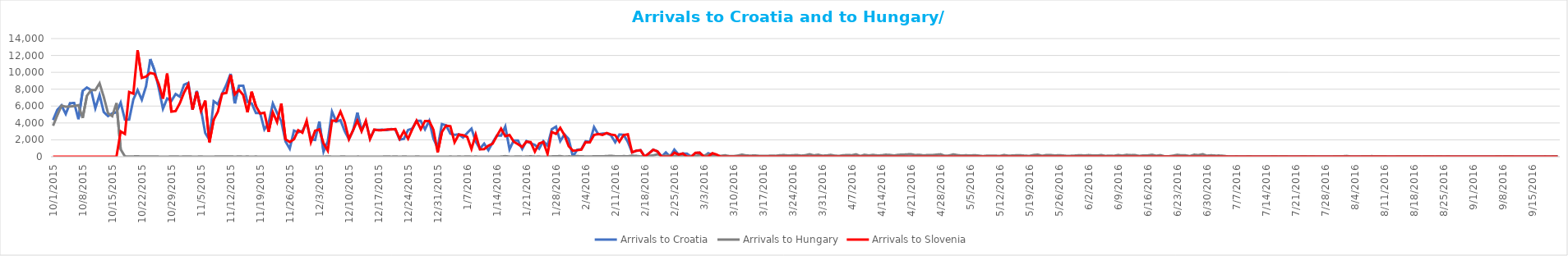
| Category | Arrivals to Croatia | Arrivals to Hungary | Arrivals to Slovenia |
|---|---|---|---|
| 10/1/15 | 4344 | 3667 | 0 |
| 10/2/15 | 5546 | 4897 | 0 |
| 10/3/15 | 6086 | 6056 | 0 |
| 10/4/15 | 5065 | 5925 | 0 |
| 10/5/15 | 6338 | 5952 | 0 |
| 10/6/15 | 6370 | 6000 | 0 |
| 10/7/15 | 4446 | 6103 | 0 |
| 10/8/15 | 7798 | 4583 | 6 |
| 10/9/15 | 8201 | 7215 | 0 |
| 10/10/15 | 7896 | 7907 | 0 |
| 10/11/15 | 5732 | 7897 | 0 |
| 10/12/15 | 7317 | 8702 | 0 |
| 10/13/15 | 5286 | 7081 | 0 |
| 10/14/15 | 4814 | 5157 | 0 |
| 10/15/15 | 5138 | 4808 | 0 |
| 10/16/15 | 5260 | 6353 | 0 |
| 10/17/15 | 6415 | 870 | 3000 |
| 10/18/15 | 4390 | 41 | 2700 |
| 10/19/15 | 4388 | 22 | 7677 |
| 10/20/15 | 6793 | 36 | 7478 |
| 10/21/15 | 7900 | 39 | 12616 |
| 10/22/15 | 6748 | 32 | 9339 |
| 10/23/15 | 8348 | 29 | 9500 |
| 10/24/15 | 11570 | 35 | 9925 |
| 10/25/15 | 10249 | 34 | 9818 |
| 10/26/15 | 8128 | 12 | 8625 |
| 10/27/15 | 5683 | 7 | 6877 |
| 10/28/15 | 6900 | 4 | 9848 |
| 10/29/15 | 6615 | 23 | 5341 |
| 10/30/15 | 7429 | 18 | 5409 |
| 10/31/15 | 7110 | 10 | 6344 |
| 11/1/15 | 8534 | 14 | 7611 |
| 11/2/15 | 8746 | 31 | 8568 |
| 11/3/15 | 5573 | 8 | 5591 |
| 11/4/15 | 7792 | 10 | 7693 |
| 11/5/15 | 5587 | 18 | 5426 |
| 11/6/15 | 2809 | 4 | 6655 |
| 11/7/15 | 2000 | 8 | 1716 |
| 11/8/15 | 6579 | 9 | 4381 |
| 11/9/15 | 6214 | 25 | 5341 |
| 11/10/15 | 7474 | 14 | 7457 |
| 11/11/15 | 8524 | 13 | 7554 |
| 11/12/15 | 9823 | 23 | 9681 |
| 11/13/15 | 6314 | 6 | 7397 |
| 11/14/15 | 8405 | 21 | 7905 |
| 11/15/15 | 8415 | 8 | 7300 |
| 11/16/15 | 6490 | 15 | 5261 |
| 11/17/15 | 6304 | 5 | 7704 |
| 11/18/15 | 5180 | 15 | 5998 |
| 11/19/15 | 5167 | 4 | 5119 |
| 11/20/15 | 3230 | 9 | 5211 |
| 11/21/15 | 3977 | 2 | 2952 |
| 11/22/15 | 6305 | 11 | 5260 |
| 11/23/15 | 5184 | 4 | 4102 |
| 11/24/15 | 4203 | 4 | 6297 |
| 11/25/15 | 1808 | 6 | 2070 |
| 11/26/15 | 952 | 10 | 1742 |
| 11/27/15 | 3095 | 2 | 2065 |
| 11/28/15 | 2886 | 6 | 3139 |
| 11/29/15 | 3060 | 3 | 2843 |
| 11/30/15 | 4009 | 7 | 4274 |
| 12/1/15 | 2066 | 4 | 1709 |
| 12/2/15 | 1982 | 4 | 3077 |
| 12/3/15 | 4174 | 9 | 3237 |
| 12/4/15 | 611 | 1 | 1577 |
| 12/5/15 | 1835 | 31 | 715 |
| 12/6/15 | 5339 | 7 | 4288 |
| 12/7/15 | 4162 | 0 | 4240 |
| 12/8/15 | 4335 | 13 | 5351 |
| 12/9/15 | 3027 | 14 | 4103 |
| 12/10/15 | 2076 | 3 | 2078 |
| 12/11/15 | 3149 | 0 | 3149 |
| 12/12/15 | 5225 | 13 | 4271 |
| 12/13/15 | 3112 | 10 | 3016 |
| 12/14/15 | 4174 | 3 | 4250 |
| 12/15/15 | 2160 | 2 | 2098 |
| 12/16/15 | 3177 | 6 | 3214 |
| 12/17/15 | 3192 | 0 | 3135 |
| 12/18/15 | 3200 | 11 | 3150 |
| 12/19/15 | 3156 | 31 | 3222 |
| 12/20/15 | 3276 | 8 | 3233 |
| 12/21/15 | 3210 | 25 | 3278 |
| 12/22/15 | 2027 | 1 | 2118 |
| 12/23/15 | 2116 | 21 | 3030 |
| 12/24/15 | 3166 | 8 | 2131 |
| 12/25/15 | 3339 | 2 | 3257 |
| 12/26/15 | 4241 | 17 | 4274 |
| 12/27/15 | 4251 | 10 | 3253 |
| 12/28/15 | 3249 | 0 | 4228 |
| 12/29/15 | 4253 | 0 | 4239 |
| 12/30/15 | 2132 | 11 | 3195 |
| 12/31/15 | 1058 | 0 | 511 |
| 1/1/16 | 3869 | 0 | 2914 |
| 1/2/16 | 3710 | 0 | 3690 |
| 1/3/16 | 2732 | 17 | 3619 |
| 1/4/16 | 2591 | 3 | 1708 |
| 1/5/16 | 2650 | 18 | 2626 |
| 1/6/16 | 2273 | 5 | 2550 |
| 1/7/16 | 2814 | 31 | 2337 |
| 1/8/16 | 3332 | 7 | 916 |
| 1/9/16 | 1799 | 15 | 2630 |
| 1/10/16 | 942 | 6 | 880 |
| 1/11/16 | 1549 | 7 | 897 |
| 1/12/16 | 769 | 2 | 1308 |
| 1/13/16 | 1679 | 5 | 1544 |
| 1/14/16 | 2502 | 4 | 2449 |
| 1/15/16 | 2493 | 14 | 3330 |
| 1/16/16 | 3579 | 65 | 2435 |
| 1/17/16 | 878 | 11 | 2570 |
| 1/18/16 | 1930 | 9 | 1783 |
| 1/19/16 | 1917 | 29 | 1476 |
| 1/20/16 | 914 | 10 | 1154 |
| 1/21/16 | 1865 | 13 | 1787 |
| 1/22/16 | 1599 | 47 | 1738 |
| 1/23/16 | 1394 | 10 | 606 |
| 1/24/16 | 946 | 15 | 1564 |
| 1/25/16 | 1847 | 5 | 1746 |
| 1/26/16 | 1309 | 4 | 326 |
| 1/27/16 | 3256 | 36 | 2935 |
| 1/28/16 | 3565 | 51 | 2719 |
| 1/29/16 | 1843 | 69 | 3416 |
| 1/30/16 | 2641 | 6 | 2556 |
| 1/31/16 | 2098 | 39 | 1249 |
| 2/1/16 | 0 | 31 | 716 |
| 2/2/16 | 822 | 69 | 765 |
| 2/3/16 | 881 | 46 | 841 |
| 2/4/16 | 1836 | 31 | 1733 |
| 2/5/16 | 1750 | 19 | 1713 |
| 2/6/16 | 3510 | 49 | 2580 |
| 2/7/16 | 2658 | 53 | 2694 |
| 2/8/16 | 2736 | 48 | 2582 |
| 2/9/16 | 2764 | 72 | 2805 |
| 2/10/16 | 2544 | 104 | 2637 |
| 2/11/16 | 1716 | 54 | 2547 |
| 2/12/16 | 2635 | 39 | 1774 |
| 2/13/16 | 2595 | 66 | 2576 |
| 2/14/16 | 1749 | 51 | 2660 |
| 2/15/16 | 512 | 119 | 516 |
| 2/16/16 | 701 | 93 | 715 |
| 2/17/16 | 769 | 34 | 769 |
| 2/18/16 | 0 | 73 | 0 |
| 2/19/16 | 408 | 113 | 407 |
| 2/20/16 | 834 | 151 | 828 |
| 2/21/16 | 630 | 288 | 623 |
| 2/22/16 | 0 | 103 | 0 |
| 2/23/16 | 507 | 112 | 0 |
| 2/24/16 | 0 | 166 | 0 |
| 2/25/16 | 841 | 76 | 478 |
| 2/26/16 | 250 | 140 | 254 |
| 2/27/16 | 385 | 111 | 382 |
| 2/28/16 | 358 | 62 | 0 |
| 2/29/16 | 0 | 78 | 0 |
| 3/1/16 | 436 | 83 | 466 |
| 3/2/16 | 476 | 181 | 479 |
| 3/3/16 | 0 | 133 | 0 |
| 3/4/16 | 410 | 268 | 0 |
| 3/5/16 | 253 | 89 | 409 |
| 3/6/16 | 0 | 72 | 253 |
| 3/7/16 | 0 | 100 | 0 |
| 3/8/16 | 0 | 167 | 0 |
| 3/9/16 | 0 | 73 | 0 |
| 3/10/16 | 0 | 70 | 0 |
| 3/11/16 | 0 | 133 | 0 |
| 3/12/16 | 0 | 245 | 0 |
| 3/13/16 | 0 | 148 | 0 |
| 3/14/16 | 0 | 123 | 0 |
| 3/15/16 | 0 | 153 | 0 |
| 3/16/16 | 0 | 104 | 0 |
| 3/17/16 | 0 | 102 | 0 |
| 3/18/16 | 0 | 95 | 0 |
| 3/19/16 | 0 | 132 | 0 |
| 3/20/16 | 0 | 107 | 0 |
| 3/21/16 | 0 | 176 | 0 |
| 3/22/16 | 0 | 188 | 0 |
| 3/23/16 | 0 | 137 | 0 |
| 3/24/16 | 0 | 171 | 0 |
| 3/25/16 | 0 | 199 | 0 |
| 3/26/16 | 0 | 125 | 0 |
| 3/27/16 | 0 | 171 | 6 |
| 3/28/16 | 0 | 293 | 0 |
| 3/29/16 | 0 | 154 | 5 |
| 3/30/16 | 0 | 234 | 4 |
| 3/31/16 | 0 | 127 | 0 |
| 4/1/16 | 0 | 142 | 0 |
| 4/2/16 | 0 | 217 | 0 |
| 4/3/16 | 0 | 119 | 0 |
| 4/4/16 | 0 | 99 | 0 |
| 4/5/16 | 0 | 176 | 2 |
| 4/6/16 | 0 | 191 | 0 |
| 4/7/16 | 0 | 178 | 0 |
| 4/8/16 | 0 | 280 | 0 |
| 4/9/16 | 0 | 83 | 0 |
| 4/10/16 | 0 | 230 | 0 |
| 4/11/16 | 0 | 149 | 0 |
| 4/12/16 | 0 | 214 | 0 |
| 4/13/16 | 0 | 150 | 0 |
| 4/14/16 | 0 | 161 | 0 |
| 4/15/16 | 0 | 237 | 0 |
| 4/16/16 | 0 | 210 | 0 |
| 4/17/16 | 0 | 144 | 0 |
| 4/18/16 | 0 | 229 | 0 |
| 4/19/16 | 0 | 235 | 0 |
| 4/20/16 | 0 | 274 | 0 |
| 4/21/16 | 0 | 294 | 0 |
| 4/22/16 | 0 | 195 | 0 |
| 4/23/16 | 0 | 226 | 0 |
| 4/24/16 | 0 | 151 | 0 |
| 4/25/16 | 0 | 202 | 0 |
| 4/26/16 | 0 | 190 | 0 |
| 4/27/16 | 0 | 241 | 0 |
| 4/28/16 | 0 | 284 | 0 |
| 4/29/16 | 0 | 108 | 0 |
| 4/30/16 | 0 | 141 | 0 |
| 5/1/16 | 0 | 274 | 0 |
| 5/2/16 | 0 | 187 | 0 |
| 5/3/16 | 0 | 131 | 0 |
| 5/4/16 | 0 | 169 | 0 |
| 5/5/16 | 0 | 133 | 0 |
| 5/6/16 | 0 | 178 | 0 |
| 5/7/16 | 0 | 132 | 0 |
| 5/8/16 | 0 | 75 | 0 |
| 5/9/16 | 0 | 124 | 0 |
| 5/10/16 | 0 | 128 | 0 |
| 5/11/16 | 0 | 120 | 0 |
| 5/12/16 | 0 | 89 | 0 |
| 5/13/16 | 0 | 201 | 0 |
| 5/14/16 | 0 | 120 | 0 |
| 5/15/16 | 0 | 139 | 0 |
| 5/16/16 | 0 | 169 | 0 |
| 5/17/16 | 0 | 164 | 0 |
| 5/18/16 | 0 | 121 | 0 |
| 5/19/16 | 0 | 100 | 0 |
| 5/20/16 | 0 | 198 | 0 |
| 5/21/16 | 0 | 245 | 0 |
| 5/22/16 | 0 | 108 | 0 |
| 5/23/16 | 0 | 193 | 0 |
| 5/24/16 | 0 | 198 | 0 |
| 5/25/16 | 0 | 139 | 0 |
| 5/26/16 | 0 | 181 | 0 |
| 5/27/16 | 0 | 144 | 0 |
| 5/28/16 | 0 | 92 | 0 |
| 5/29/16 | 0 | 115 | 0 |
| 5/30/16 | 0 | 140 | 0 |
| 5/31/16 | 0 | 182 | 0 |
| 6/1/16 | 0 | 138 | 0 |
| 6/2/16 | 0 | 187 | 0 |
| 6/3/16 | 0 | 146 | 0 |
| 6/4/16 | 0 | 135 | 0 |
| 6/5/16 | 0 | 193 | 0 |
| 6/6/16 | 0 | 100 | 0 |
| 6/7/16 | 0 | 131 | 0 |
| 6/8/16 | 0 | 104 | 0 |
| 6/9/16 | 0 | 201 | 0 |
| 6/10/16 | 0 | 129 | 0 |
| 6/11/16 | 0 | 219 | 0 |
| 6/12/16 | 0 | 181 | 0 |
| 6/13/16 | 0 | 189 | 0 |
| 6/14/16 | 0 | 95 | 0 |
| 6/15/16 | 0 | 155 | 0 |
| 6/16/16 | 0 | 147 | 0 |
| 6/17/16 | 0 | 230 | 0 |
| 6/18/16 | 0 | 114 | 0 |
| 6/19/16 | 0 | 185 | 0 |
| 6/20/16 | 0 | 47 | 0 |
| 6/21/16 | 0 | 52 | 0 |
| 6/22/16 | 0 | 125 | 0 |
| 6/23/16 | 0 | 223 | 0 |
| 6/24/16 | 0 | 159 | 0 |
| 6/25/16 | 0 | 159 | 0 |
| 6/26/16 | 0 | 75 | 0 |
| 6/27/16 | 0 | 238 | 0 |
| 6/28/16 | 0 | 186 | 0 |
| 6/29/16 | 0 | 295 | 0 |
| 6/30/16 | 0 | 125 | 0 |
| 7/1/16 | 0 | 167 | 0 |
| 7/2/16 | 0 | 133 | 0 |
| 7/3/16 | 0 | 134 | 0 |
| 7/4/16 | 0 | 99 | 0 |
| 7/5/16 | 0 | 30 | 0 |
| 7/6/16 | 0 | 33 | 0 |
| 7/7/16 | 0 | 38 | 0 |
| 7/8/16 | 0 | 32 | 0 |
| 7/9/16 | 0 | 31 | 0 |
| 7/10/16 | 0 | 48 | 0 |
| 7/11/16 | 0 | 29 | 0 |
| 7/12/16 | 0 | 30 | 0 |
| 7/13/16 | 0 | 33 | 0 |
| 7/14/16 | 0 | 34 | 0 |
| 7/15/16 | 0 | 35 | 0 |
| 7/16/16 | 0 | 47 | 0 |
| 7/17/16 | 0 | 32 | 0 |
| 7/18/16 | 0 | 48 | 0 |
| 7/19/16 | 0 | 37 | 0 |
| 7/20/16 | 0 | 31 | 0 |
| 7/21/16 | 0 | 35 | 0 |
| 7/22/16 | 0 | 35 | 0 |
| 7/23/16 | 0 | 46 | 0 |
| 7/24/16 | 0 | 31 | 0 |
| 7/25/16 | 0 | 45 | 0 |
| 7/26/16 | 0 | 31 | 0 |
| 7/27/16 | 0 | 30 | 0 |
| 7/28/16 | 0 | 36 | 0 |
| 7/29/16 | 0 | 33 | 0 |
| 7/30/16 | 0 | 37 | 0 |
| 7/31/16 | 0 | 37 | 0 |
| 8/1/16 | 0 | 42 | 0 |
| 8/2/16 | 0 | 87 | 0 |
| 8/3/16 | 0 | 30 | 0 |
| 8/4/16 | 0 | 30 | 0 |
| 8/5/16 | 0 | 33 | 0 |
| 8/6/16 | 0 | 40 | 0 |
| 8/7/16 | 0 | 37 | 0 |
| 8/8/16 | 0 | 64 | 0 |
| 8/9/16 | 0 | 39 | 0 |
| 8/10/16 | 0 | 37 | 0 |
| 8/11/16 | 0 | 42 | 0 |
| 8/12/16 | 0 | 31 | 0 |
| 8/13/16 | 0 | 32 | 0 |
| 8/14/16 | 0 | 38 | 0 |
| 8/15/16 | 0 | 46 | 0 |
| 8/16/16 | 0 | 58 | 0 |
| 8/17/16 | 0 | 47 | 0 |
| 8/18/16 | 0 | 58 | 0 |
| 8/19/16 | 0 | 38 | 0 |
| 8/20/16 | 0 | 35 | 0 |
| 8/21/16 | 0 | 45 | 0 |
| 8/22/16 | 0 | 50 | 0 |
| 8/23/16 | 0 | 33 | 0 |
| 8/24/16 | 0 | 49 | 0 |
| 8/25/16 | 0 | 31 | 0 |
| 8/26/16 | 0 | 40 | 0 |
| 8/27/16 | 0 | 33 | 0 |
| 8/28/16 | 0 | 27 | 0 |
| 8/29/16 | 0 | 32 | 0 |
| 8/30/16 | 0 | 31 | 0 |
| 8/31/16 | 0 | 32 | 0 |
| 9/1/16 | 0 | 31 | 0 |
| 9/2/16 | 0 | 29 | 0 |
| 9/3/16 | 0 | 30 | 0 |
| 9/4/16 | 0 | 31 | 0 |
| 9/5/16 | 0 | 35 | 0 |
| 9/6/16 | 0 | 32 | 0 |
| 9/7/16 | 0 | 48 | 0 |
| 9/8/16 | 0 | 33 | 0 |
| 9/9/16 | 0 | 56 | 0 |
| 9/10/16 | 0 | 43 | 0 |
| 9/11/16 | 0 | 32 | 0 |
| 9/12/16 | 0 | 31 | 0 |
| 9/13/16 | 0 | 33 | 0 |
| 9/14/16 | 0 | 27 | 0 |
| 9/15/16 | 0 | 33 | 0 |
| 9/16/16 | 0 | 27 | 0 |
| 9/17/16 | 0 | 28 | 0 |
| 9/18/16 | 0 | 38 | 0 |
| 9/19/16 | 0 | 30 | 0 |
| 9/20/16 | 0 | 41 | 0 |
| 9/21/16 | 0 | 40 | 0 |